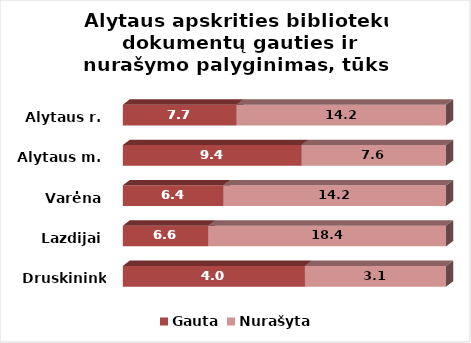
| Category | Gauta | Nurašyta |
|---|---|---|
| Druskininkai | 4 | 3.1 |
| Lazdijai | 6.6 | 18.4 |
| Varėna | 6.4 | 14.2 |
| Alytaus m. | 9.4 | 7.6 |
| Alytaus r. | 7.7 | 14.2 |